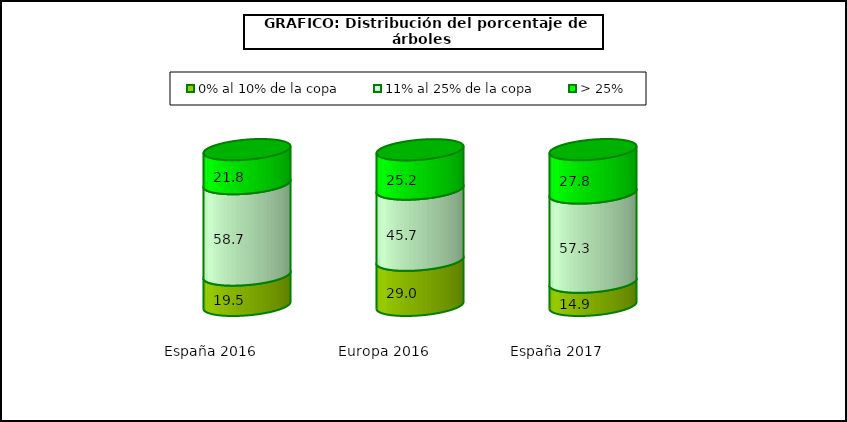
| Category | 0% al 10% de la copa | 11% al 25% de la copa | > 25% |
|---|---|---|---|
| España 2016 | 19.5 | 58.7 | 21.8 |
| Europa 2016 | 29 | 45.7 | 25.2 |
| España 2017 | 14.9 | 57.3 | 27.8 |